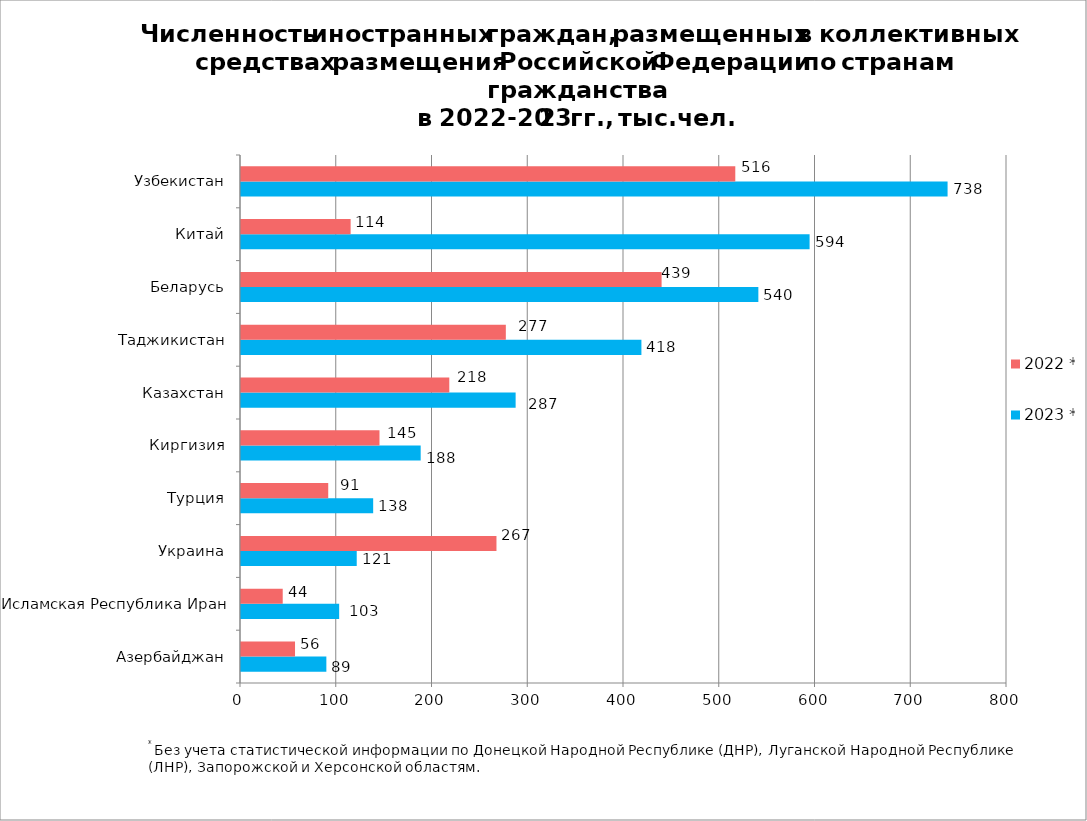
| Category | 2023 * | 2022 * |
|---|---|---|
| Азербайджан | 89.149 | 56.417 |
| Исламская Республика Иран | 102.52 | 43.575 |
| Украина | 120.869 | 266.807 |
| Турция | 138.041 | 91.099 |
| Киргизия | 187.658 | 144.637 |
| Казахстан | 286.816 | 217.54 |
| Таджикистан | 418.185 | 276.585 |
| Беларусь | 540.318 | 439.263 |
| Китай | 593.832 | 114.499 |
| Узбекистан | 737.939 | 516.23 |